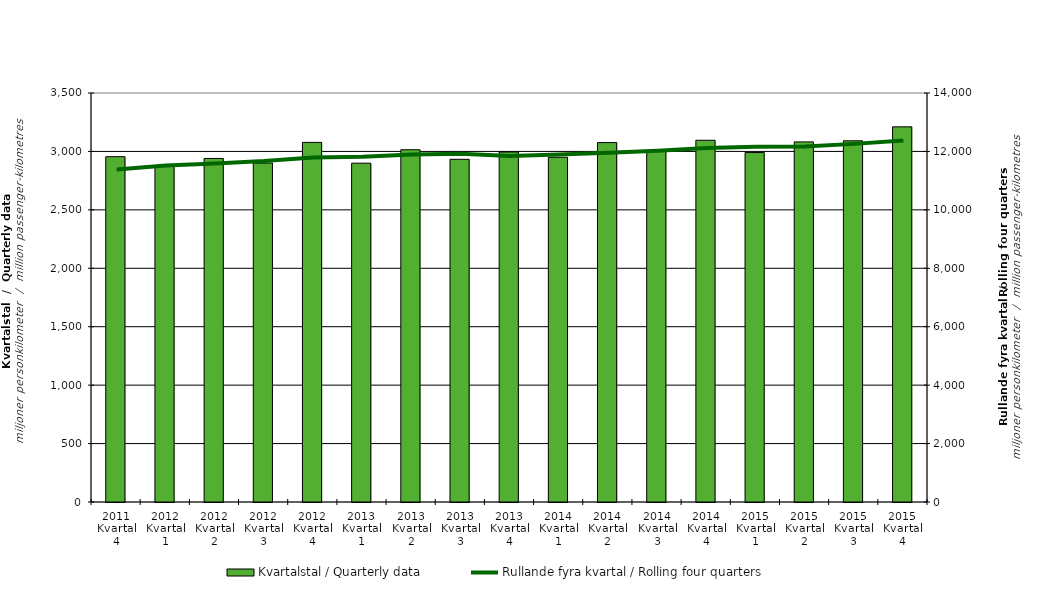
| Category | Kvartalstal / Quarterly data |
|---|---|
| 2011 Kvartal 4 | 2955.113 |
| 2012 Kvartal 1 | 2874.33 |
| 2012 Kvartal 2 | 2939.777 |
| 2012 Kvartal 3 | 2900.638 |
| 2012 Kvartal 4 | 3077.393 |
| 2013 Kvartal 1 | 2899.281 |
| 2013 Kvartal 2 | 3014.574 |
| 2013 Kvartal 3 | 2932.563 |
| 2013 Kvartal 4 | 2995.246 |
| 2014 Kvartal 1 | 2950.13 |
| 2014 Kvartal 2 | 3075.752 |
| 2014 Kvartal 3 | 2999.774 |
| 2014 Kvartal 4 | 3095.522 |
| 2015 Kvartal 1 | 2990.41 |
| 2015 Kvartal 2 | 3081.604 |
| 2015 Kvartal 3 | 3090.967 |
| 2015 Kvartal 4 | 3210.48 |